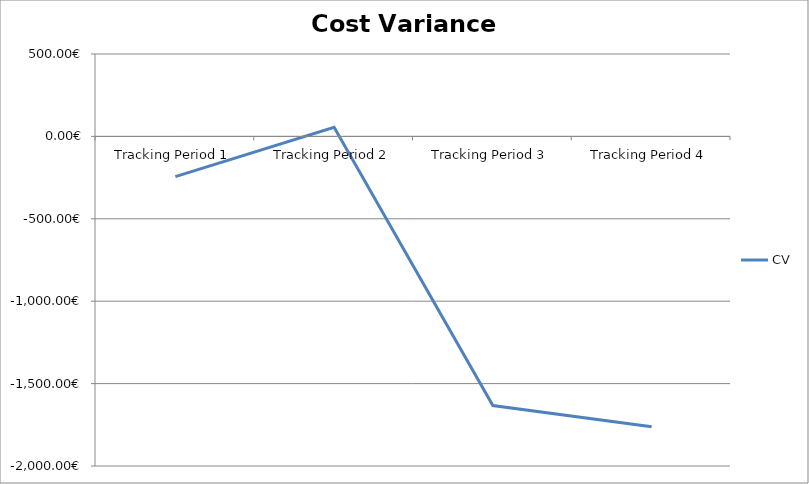
| Category | CV |
|---|---|
| Tracking Period 1 | -244 |
| Tracking Period 2 | 55 |
| Tracking Period 3 | -1633 |
| Tracking Period 4 | -1762 |